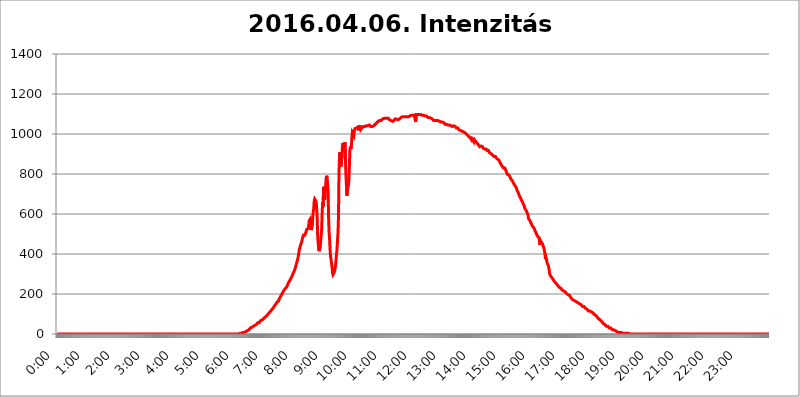
| Category | 2016.04.06. Intenzitás [W/m^2] |
|---|---|
| 0.0 | 0 |
| 0.0006944444444444445 | 0 |
| 0.001388888888888889 | 0 |
| 0.0020833333333333333 | 0 |
| 0.002777777777777778 | 0 |
| 0.003472222222222222 | 0 |
| 0.004166666666666667 | 0 |
| 0.004861111111111111 | 0 |
| 0.005555555555555556 | 0 |
| 0.0062499999999999995 | 0 |
| 0.006944444444444444 | 0 |
| 0.007638888888888889 | 0 |
| 0.008333333333333333 | 0 |
| 0.009027777777777779 | 0 |
| 0.009722222222222222 | 0 |
| 0.010416666666666666 | 0 |
| 0.011111111111111112 | 0 |
| 0.011805555555555555 | 0 |
| 0.012499999999999999 | 0 |
| 0.013194444444444444 | 0 |
| 0.013888888888888888 | 0 |
| 0.014583333333333332 | 0 |
| 0.015277777777777777 | 0 |
| 0.015972222222222224 | 0 |
| 0.016666666666666666 | 0 |
| 0.017361111111111112 | 0 |
| 0.018055555555555557 | 0 |
| 0.01875 | 0 |
| 0.019444444444444445 | 0 |
| 0.02013888888888889 | 0 |
| 0.020833333333333332 | 0 |
| 0.02152777777777778 | 0 |
| 0.022222222222222223 | 0 |
| 0.02291666666666667 | 0 |
| 0.02361111111111111 | 0 |
| 0.024305555555555556 | 0 |
| 0.024999999999999998 | 0 |
| 0.025694444444444447 | 0 |
| 0.02638888888888889 | 0 |
| 0.027083333333333334 | 0 |
| 0.027777777777777776 | 0 |
| 0.02847222222222222 | 0 |
| 0.029166666666666664 | 0 |
| 0.029861111111111113 | 0 |
| 0.030555555555555555 | 0 |
| 0.03125 | 0 |
| 0.03194444444444445 | 0 |
| 0.03263888888888889 | 0 |
| 0.03333333333333333 | 0 |
| 0.034027777777777775 | 0 |
| 0.034722222222222224 | 0 |
| 0.035416666666666666 | 0 |
| 0.036111111111111115 | 0 |
| 0.03680555555555556 | 0 |
| 0.0375 | 0 |
| 0.03819444444444444 | 0 |
| 0.03888888888888889 | 0 |
| 0.03958333333333333 | 0 |
| 0.04027777777777778 | 0 |
| 0.04097222222222222 | 0 |
| 0.041666666666666664 | 0 |
| 0.042361111111111106 | 0 |
| 0.04305555555555556 | 0 |
| 0.043750000000000004 | 0 |
| 0.044444444444444446 | 0 |
| 0.04513888888888889 | 0 |
| 0.04583333333333334 | 0 |
| 0.04652777777777778 | 0 |
| 0.04722222222222222 | 0 |
| 0.04791666666666666 | 0 |
| 0.04861111111111111 | 0 |
| 0.049305555555555554 | 0 |
| 0.049999999999999996 | 0 |
| 0.05069444444444445 | 0 |
| 0.051388888888888894 | 0 |
| 0.052083333333333336 | 0 |
| 0.05277777777777778 | 0 |
| 0.05347222222222222 | 0 |
| 0.05416666666666667 | 0 |
| 0.05486111111111111 | 0 |
| 0.05555555555555555 | 0 |
| 0.05625 | 0 |
| 0.05694444444444444 | 0 |
| 0.057638888888888885 | 0 |
| 0.05833333333333333 | 0 |
| 0.05902777777777778 | 0 |
| 0.059722222222222225 | 0 |
| 0.06041666666666667 | 0 |
| 0.061111111111111116 | 0 |
| 0.06180555555555556 | 0 |
| 0.0625 | 0 |
| 0.06319444444444444 | 0 |
| 0.06388888888888888 | 0 |
| 0.06458333333333334 | 0 |
| 0.06527777777777778 | 0 |
| 0.06597222222222222 | 0 |
| 0.06666666666666667 | 0 |
| 0.06736111111111111 | 0 |
| 0.06805555555555555 | 0 |
| 0.06874999999999999 | 0 |
| 0.06944444444444443 | 0 |
| 0.07013888888888889 | 0 |
| 0.07083333333333333 | 0 |
| 0.07152777777777779 | 0 |
| 0.07222222222222223 | 0 |
| 0.07291666666666667 | 0 |
| 0.07361111111111111 | 0 |
| 0.07430555555555556 | 0 |
| 0.075 | 0 |
| 0.07569444444444444 | 0 |
| 0.0763888888888889 | 0 |
| 0.07708333333333334 | 0 |
| 0.07777777777777778 | 0 |
| 0.07847222222222222 | 0 |
| 0.07916666666666666 | 0 |
| 0.0798611111111111 | 0 |
| 0.08055555555555556 | 0 |
| 0.08125 | 0 |
| 0.08194444444444444 | 0 |
| 0.08263888888888889 | 0 |
| 0.08333333333333333 | 0 |
| 0.08402777777777777 | 0 |
| 0.08472222222222221 | 0 |
| 0.08541666666666665 | 0 |
| 0.08611111111111112 | 0 |
| 0.08680555555555557 | 0 |
| 0.08750000000000001 | 0 |
| 0.08819444444444445 | 0 |
| 0.08888888888888889 | 0 |
| 0.08958333333333333 | 0 |
| 0.09027777777777778 | 0 |
| 0.09097222222222222 | 0 |
| 0.09166666666666667 | 0 |
| 0.09236111111111112 | 0 |
| 0.09305555555555556 | 0 |
| 0.09375 | 0 |
| 0.09444444444444444 | 0 |
| 0.09513888888888888 | 0 |
| 0.09583333333333333 | 0 |
| 0.09652777777777777 | 0 |
| 0.09722222222222222 | 0 |
| 0.09791666666666667 | 0 |
| 0.09861111111111111 | 0 |
| 0.09930555555555555 | 0 |
| 0.09999999999999999 | 0 |
| 0.10069444444444443 | 0 |
| 0.1013888888888889 | 0 |
| 0.10208333333333335 | 0 |
| 0.10277777777777779 | 0 |
| 0.10347222222222223 | 0 |
| 0.10416666666666667 | 0 |
| 0.10486111111111111 | 0 |
| 0.10555555555555556 | 0 |
| 0.10625 | 0 |
| 0.10694444444444444 | 0 |
| 0.1076388888888889 | 0 |
| 0.10833333333333334 | 0 |
| 0.10902777777777778 | 0 |
| 0.10972222222222222 | 0 |
| 0.1111111111111111 | 0 |
| 0.11180555555555556 | 0 |
| 0.11180555555555556 | 0 |
| 0.1125 | 0 |
| 0.11319444444444444 | 0 |
| 0.11388888888888889 | 0 |
| 0.11458333333333333 | 0 |
| 0.11527777777777777 | 0 |
| 0.11597222222222221 | 0 |
| 0.11666666666666665 | 0 |
| 0.1173611111111111 | 0 |
| 0.11805555555555557 | 0 |
| 0.11944444444444445 | 0 |
| 0.12013888888888889 | 0 |
| 0.12083333333333333 | 0 |
| 0.12152777777777778 | 0 |
| 0.12222222222222223 | 0 |
| 0.12291666666666667 | 0 |
| 0.12291666666666667 | 0 |
| 0.12361111111111112 | 0 |
| 0.12430555555555556 | 0 |
| 0.125 | 0 |
| 0.12569444444444444 | 0 |
| 0.12638888888888888 | 0 |
| 0.12708333333333333 | 0 |
| 0.16875 | 0 |
| 0.12847222222222224 | 0 |
| 0.12916666666666668 | 0 |
| 0.12986111111111112 | 0 |
| 0.13055555555555556 | 0 |
| 0.13125 | 0 |
| 0.13194444444444445 | 0 |
| 0.1326388888888889 | 0 |
| 0.13333333333333333 | 0 |
| 0.13402777777777777 | 0 |
| 0.13402777777777777 | 0 |
| 0.13472222222222222 | 0 |
| 0.13541666666666666 | 0 |
| 0.1361111111111111 | 0 |
| 0.13749999999999998 | 0 |
| 0.13819444444444443 | 0 |
| 0.1388888888888889 | 0 |
| 0.13958333333333334 | 0 |
| 0.14027777777777778 | 0 |
| 0.14097222222222222 | 0 |
| 0.14166666666666666 | 0 |
| 0.1423611111111111 | 0 |
| 0.14305555555555557 | 0 |
| 0.14375000000000002 | 0 |
| 0.14444444444444446 | 0 |
| 0.1451388888888889 | 0 |
| 0.1451388888888889 | 0 |
| 0.14652777777777778 | 0 |
| 0.14722222222222223 | 0 |
| 0.14791666666666667 | 0 |
| 0.1486111111111111 | 0 |
| 0.14930555555555555 | 0 |
| 0.15 | 0 |
| 0.15069444444444444 | 0 |
| 0.15138888888888888 | 0 |
| 0.15208333333333332 | 0 |
| 0.15277777777777776 | 0 |
| 0.15347222222222223 | 0 |
| 0.15416666666666667 | 0 |
| 0.15486111111111112 | 0 |
| 0.15555555555555556 | 0 |
| 0.15625 | 0 |
| 0.15694444444444444 | 0 |
| 0.15763888888888888 | 0 |
| 0.15833333333333333 | 0 |
| 0.15902777777777777 | 0 |
| 0.15972222222222224 | 0 |
| 0.16041666666666668 | 0 |
| 0.16111111111111112 | 0 |
| 0.16180555555555556 | 0 |
| 0.1625 | 0 |
| 0.16319444444444445 | 0 |
| 0.1638888888888889 | 0 |
| 0.16458333333333333 | 0 |
| 0.16527777777777777 | 0 |
| 0.16597222222222222 | 0 |
| 0.16666666666666666 | 0 |
| 0.1673611111111111 | 0 |
| 0.16805555555555554 | 0 |
| 0.16874999999999998 | 0 |
| 0.16944444444444443 | 0 |
| 0.17013888888888887 | 0 |
| 0.1708333333333333 | 0 |
| 0.17152777777777775 | 0 |
| 0.17222222222222225 | 0 |
| 0.1729166666666667 | 0 |
| 0.17361111111111113 | 0 |
| 0.17430555555555557 | 0 |
| 0.17500000000000002 | 0 |
| 0.17569444444444446 | 0 |
| 0.1763888888888889 | 0 |
| 0.17708333333333334 | 0 |
| 0.17777777777777778 | 0 |
| 0.17847222222222223 | 0 |
| 0.17916666666666667 | 0 |
| 0.1798611111111111 | 0 |
| 0.18055555555555555 | 0 |
| 0.18125 | 0 |
| 0.18194444444444444 | 0 |
| 0.1826388888888889 | 0 |
| 0.18333333333333335 | 0 |
| 0.1840277777777778 | 0 |
| 0.18472222222222223 | 0 |
| 0.18541666666666667 | 0 |
| 0.18611111111111112 | 0 |
| 0.18680555555555556 | 0 |
| 0.1875 | 0 |
| 0.18819444444444444 | 0 |
| 0.18888888888888888 | 0 |
| 0.18958333333333333 | 0 |
| 0.19027777777777777 | 0 |
| 0.1909722222222222 | 0 |
| 0.19166666666666665 | 0 |
| 0.19236111111111112 | 0 |
| 0.19305555555555554 | 0 |
| 0.19375 | 0 |
| 0.19444444444444445 | 0 |
| 0.1951388888888889 | 0 |
| 0.19583333333333333 | 0 |
| 0.19652777777777777 | 0 |
| 0.19722222222222222 | 0 |
| 0.19791666666666666 | 0 |
| 0.1986111111111111 | 0 |
| 0.19930555555555554 | 0 |
| 0.19999999999999998 | 0 |
| 0.20069444444444443 | 0 |
| 0.20138888888888887 | 0 |
| 0.2020833333333333 | 0 |
| 0.2027777777777778 | 0 |
| 0.2034722222222222 | 0 |
| 0.2041666666666667 | 0 |
| 0.20486111111111113 | 0 |
| 0.20555555555555557 | 0 |
| 0.20625000000000002 | 0 |
| 0.20694444444444446 | 0 |
| 0.2076388888888889 | 0 |
| 0.20833333333333334 | 0 |
| 0.20902777777777778 | 0 |
| 0.20972222222222223 | 0 |
| 0.21041666666666667 | 0 |
| 0.2111111111111111 | 0 |
| 0.21180555555555555 | 0 |
| 0.2125 | 0 |
| 0.21319444444444444 | 0 |
| 0.2138888888888889 | 0 |
| 0.21458333333333335 | 0 |
| 0.2152777777777778 | 0 |
| 0.21597222222222223 | 0 |
| 0.21666666666666667 | 0 |
| 0.21736111111111112 | 0 |
| 0.21805555555555556 | 0 |
| 0.21875 | 0 |
| 0.21944444444444444 | 0 |
| 0.22013888888888888 | 0 |
| 0.22083333333333333 | 0 |
| 0.22152777777777777 | 0 |
| 0.2222222222222222 | 0 |
| 0.22291666666666665 | 0 |
| 0.2236111111111111 | 0 |
| 0.22430555555555556 | 0 |
| 0.225 | 0 |
| 0.22569444444444445 | 0 |
| 0.2263888888888889 | 0 |
| 0.22708333333333333 | 0 |
| 0.22777777777777777 | 0 |
| 0.22847222222222222 | 0 |
| 0.22916666666666666 | 0 |
| 0.2298611111111111 | 0 |
| 0.23055555555555554 | 0 |
| 0.23124999999999998 | 0 |
| 0.23194444444444443 | 0 |
| 0.23263888888888887 | 0 |
| 0.2333333333333333 | 0 |
| 0.2340277777777778 | 0 |
| 0.2347222222222222 | 0 |
| 0.2354166666666667 | 0 |
| 0.23611111111111113 | 0 |
| 0.23680555555555557 | 0 |
| 0.23750000000000002 | 0 |
| 0.23819444444444446 | 0 |
| 0.2388888888888889 | 0 |
| 0.23958333333333334 | 0 |
| 0.24027777777777778 | 0 |
| 0.24097222222222223 | 0 |
| 0.24166666666666667 | 0 |
| 0.2423611111111111 | 0 |
| 0.24305555555555555 | 0 |
| 0.24375 | 0 |
| 0.24444444444444446 | 0 |
| 0.24513888888888888 | 0 |
| 0.24583333333333335 | 0 |
| 0.2465277777777778 | 0 |
| 0.24722222222222223 | 0 |
| 0.24791666666666667 | 0 |
| 0.24861111111111112 | 0 |
| 0.24930555555555556 | 0 |
| 0.25 | 0 |
| 0.25069444444444444 | 0 |
| 0.2513888888888889 | 0 |
| 0.2520833333333333 | 0 |
| 0.25277777777777777 | 0 |
| 0.2534722222222222 | 0 |
| 0.25416666666666665 | 0 |
| 0.2548611111111111 | 0 |
| 0.2555555555555556 | 3.525 |
| 0.25625000000000003 | 3.525 |
| 0.2569444444444445 | 3.525 |
| 0.2576388888888889 | 3.525 |
| 0.25833333333333336 | 3.525 |
| 0.2590277777777778 | 3.525 |
| 0.25972222222222224 | 3.525 |
| 0.2604166666666667 | 7.887 |
| 0.2611111111111111 | 7.887 |
| 0.26180555555555557 | 7.887 |
| 0.2625 | 7.887 |
| 0.26319444444444445 | 12.257 |
| 0.2638888888888889 | 12.257 |
| 0.26458333333333334 | 12.257 |
| 0.2652777777777778 | 16.636 |
| 0.2659722222222222 | 16.636 |
| 0.26666666666666666 | 16.636 |
| 0.2673611111111111 | 21.024 |
| 0.26805555555555555 | 21.024 |
| 0.26875 | 21.024 |
| 0.26944444444444443 | 25.419 |
| 0.2701388888888889 | 25.419 |
| 0.2708333333333333 | 29.823 |
| 0.27152777777777776 | 29.823 |
| 0.2722222222222222 | 29.823 |
| 0.27291666666666664 | 34.234 |
| 0.2736111111111111 | 34.234 |
| 0.2743055555555555 | 34.234 |
| 0.27499999999999997 | 38.653 |
| 0.27569444444444446 | 38.653 |
| 0.27638888888888885 | 38.653 |
| 0.27708333333333335 | 43.079 |
| 0.2777777777777778 | 43.079 |
| 0.27847222222222223 | 47.511 |
| 0.2791666666666667 | 47.511 |
| 0.2798611111111111 | 47.511 |
| 0.28055555555555556 | 51.951 |
| 0.28125 | 56.398 |
| 0.28194444444444444 | 56.398 |
| 0.2826388888888889 | 56.398 |
| 0.2833333333333333 | 56.398 |
| 0.28402777777777777 | 60.85 |
| 0.2847222222222222 | 65.31 |
| 0.28541666666666665 | 65.31 |
| 0.28611111111111115 | 65.31 |
| 0.28680555555555554 | 69.775 |
| 0.28750000000000003 | 69.775 |
| 0.2881944444444445 | 74.246 |
| 0.2888888888888889 | 74.246 |
| 0.28958333333333336 | 74.246 |
| 0.2902777777777778 | 78.722 |
| 0.29097222222222224 | 83.205 |
| 0.2916666666666667 | 83.205 |
| 0.2923611111111111 | 83.205 |
| 0.29305555555555557 | 87.692 |
| 0.29375 | 92.184 |
| 0.29444444444444445 | 92.184 |
| 0.2951388888888889 | 96.682 |
| 0.29583333333333334 | 101.184 |
| 0.2965277777777778 | 101.184 |
| 0.2972222222222222 | 105.69 |
| 0.29791666666666666 | 110.201 |
| 0.2986111111111111 | 110.201 |
| 0.29930555555555555 | 114.716 |
| 0.3 | 114.716 |
| 0.30069444444444443 | 119.235 |
| 0.3013888888888889 | 123.758 |
| 0.3020833333333333 | 128.284 |
| 0.30277777777777776 | 128.284 |
| 0.3034722222222222 | 132.814 |
| 0.30416666666666664 | 137.347 |
| 0.3048611111111111 | 141.884 |
| 0.3055555555555555 | 146.423 |
| 0.30624999999999997 | 146.423 |
| 0.3069444444444444 | 150.964 |
| 0.3076388888888889 | 155.509 |
| 0.30833333333333335 | 160.056 |
| 0.3090277777777778 | 164.605 |
| 0.30972222222222223 | 164.605 |
| 0.3104166666666667 | 164.605 |
| 0.3111111111111111 | 173.709 |
| 0.31180555555555556 | 178.264 |
| 0.3125 | 182.82 |
| 0.31319444444444444 | 187.378 |
| 0.3138888888888889 | 191.937 |
| 0.3145833333333333 | 196.497 |
| 0.31527777777777777 | 201.058 |
| 0.3159722222222222 | 205.62 |
| 0.31666666666666665 | 210.182 |
| 0.31736111111111115 | 214.746 |
| 0.31805555555555554 | 219.309 |
| 0.31875000000000003 | 219.309 |
| 0.3194444444444445 | 223.873 |
| 0.3201388888888889 | 228.436 |
| 0.32083333333333336 | 228.436 |
| 0.3215277777777778 | 233 |
| 0.32222222222222224 | 237.564 |
| 0.3229166666666667 | 242.127 |
| 0.3236111111111111 | 251.251 |
| 0.32430555555555557 | 255.813 |
| 0.325 | 260.373 |
| 0.32569444444444445 | 260.373 |
| 0.3263888888888889 | 269.49 |
| 0.32708333333333334 | 269.49 |
| 0.3277777777777778 | 278.603 |
| 0.3284722222222222 | 283.156 |
| 0.32916666666666666 | 287.709 |
| 0.3298611111111111 | 292.259 |
| 0.33055555555555555 | 301.354 |
| 0.33125 | 305.898 |
| 0.33194444444444443 | 310.44 |
| 0.3326388888888889 | 314.98 |
| 0.3333333333333333 | 324.052 |
| 0.3340277777777778 | 333.113 |
| 0.3347222222222222 | 342.162 |
| 0.3354166666666667 | 351.198 |
| 0.3361111111111111 | 360.221 |
| 0.3368055555555556 | 369.23 |
| 0.33749999999999997 | 378.224 |
| 0.33819444444444446 | 391.685 |
| 0.33888888888888885 | 405.108 |
| 0.33958333333333335 | 422.943 |
| 0.34027777777777773 | 431.833 |
| 0.34097222222222223 | 440.702 |
| 0.3416666666666666 | 449.551 |
| 0.3423611111111111 | 453.968 |
| 0.3430555555555555 | 462.786 |
| 0.34375 | 475.972 |
| 0.3444444444444445 | 484.735 |
| 0.3451388888888889 | 493.475 |
| 0.3458333333333334 | 493.475 |
| 0.34652777777777777 | 489.108 |
| 0.34722222222222227 | 493.475 |
| 0.34791666666666665 | 489.108 |
| 0.34861111111111115 | 497.836 |
| 0.34930555555555554 | 515.223 |
| 0.35000000000000003 | 523.88 |
| 0.3506944444444444 | 519.555 |
| 0.3513888888888889 | 519.555 |
| 0.3520833333333333 | 528.2 |
| 0.3527777777777778 | 545.416 |
| 0.3534722222222222 | 566.793 |
| 0.3541666666666667 | 562.53 |
| 0.3548611111111111 | 575.299 |
| 0.35555555555555557 | 562.53 |
| 0.35625 | 519.555 |
| 0.35694444444444445 | 532.513 |
| 0.3576388888888889 | 541.121 |
| 0.35833333333333334 | 545.416 |
| 0.3590277777777778 | 613.252 |
| 0.3597222222222222 | 625.784 |
| 0.36041666666666666 | 667.123 |
| 0.3611111111111111 | 675.311 |
| 0.36180555555555555 | 679.395 |
| 0.3625 | 667.123 |
| 0.36319444444444443 | 658.909 |
| 0.3638888888888889 | 625.784 |
| 0.3645833333333333 | 579.542 |
| 0.3652777777777778 | 484.735 |
| 0.3659722222222222 | 480.356 |
| 0.3666666666666667 | 422.943 |
| 0.3673611111111111 | 414.035 |
| 0.3680555555555556 | 414.035 |
| 0.36874999999999997 | 436.27 |
| 0.36944444444444446 | 462.786 |
| 0.37013888888888885 | 493.475 |
| 0.37083333333333335 | 523.88 |
| 0.37152777777777773 | 604.864 |
| 0.37222222222222223 | 658.909 |
| 0.3729166666666666 | 638.256 |
| 0.3736111111111111 | 735.89 |
| 0.3743055555555555 | 711.832 |
| 0.375 | 671.22 |
| 0.3756944444444445 | 691.608 |
| 0.3763888888888889 | 691.608 |
| 0.3770833333333334 | 775.492 |
| 0.37777777777777777 | 791.169 |
| 0.37847222222222227 | 783.342 |
| 0.37916666666666665 | 755.766 |
| 0.37986111111111115 | 715.858 |
| 0.38055555555555554 | 583.779 |
| 0.38125000000000003 | 510.885 |
| 0.3819444444444444 | 475.972 |
| 0.3826388888888889 | 422.943 |
| 0.3833333333333333 | 387.202 |
| 0.3840277777777778 | 373.729 |
| 0.3847222222222222 | 351.198 |
| 0.3854166666666667 | 333.113 |
| 0.3861111111111111 | 305.898 |
| 0.38680555555555557 | 296.808 |
| 0.3875 | 296.808 |
| 0.38819444444444445 | 305.898 |
| 0.3888888888888889 | 305.898 |
| 0.38958333333333334 | 324.052 |
| 0.3902777777777778 | 342.162 |
| 0.3909722222222222 | 369.23 |
| 0.39166666666666666 | 400.638 |
| 0.3923611111111111 | 422.943 |
| 0.39305555555555555 | 467.187 |
| 0.39375 | 506.542 |
| 0.39444444444444443 | 588.009 |
| 0.3951388888888889 | 806.757 |
| 0.3958333333333333 | 887.309 |
| 0.3965277777777778 | 909.996 |
| 0.3972222222222222 | 875.918 |
| 0.3979166666666667 | 837.682 |
| 0.3986111111111111 | 868.305 |
| 0.3993055555555556 | 883.516 |
| 0.39999999999999997 | 940.082 |
| 0.40069444444444446 | 955.071 |
| 0.40138888888888885 | 928.819 |
| 0.40208333333333335 | 917.534 |
| 0.40277777777777773 | 940.082 |
| 0.40347222222222223 | 958.814 |
| 0.4041666666666666 | 875.918 |
| 0.4048611111111111 | 798.974 |
| 0.4055555555555555 | 743.859 |
| 0.40625 | 691.608 |
| 0.4069444444444445 | 687.544 |
| 0.4076388888888889 | 735.89 |
| 0.4083333333333334 | 743.859 |
| 0.40902777777777777 | 767.62 |
| 0.40972222222222227 | 837.682 |
| 0.41041666666666665 | 917.534 |
| 0.41111111111111115 | 936.33 |
| 0.41180555555555554 | 925.06 |
| 0.41250000000000003 | 940.082 |
| 0.4131944444444444 | 981.244 |
| 0.4138888888888889 | 1007.383 |
| 0.4145833333333333 | 1011.118 |
| 0.4152777777777778 | 1007.383 |
| 0.4159722222222222 | 992.448 |
| 0.4166666666666667 | 1018.587 |
| 0.4173611111111111 | 1026.06 |
| 0.41805555555555557 | 1026.06 |
| 0.41875 | 1029.798 |
| 0.41944444444444445 | 1029.798 |
| 0.4201388888888889 | 1033.537 |
| 0.42083333333333334 | 1029.798 |
| 0.4215277777777778 | 1033.537 |
| 0.4222222222222222 | 1018.587 |
| 0.42291666666666666 | 1037.277 |
| 0.4236111111111111 | 1037.277 |
| 0.42430555555555555 | 1037.277 |
| 0.425 | 1037.277 |
| 0.42569444444444443 | 1022.323 |
| 0.4263888888888889 | 1022.323 |
| 0.4270833333333333 | 1029.798 |
| 0.4277777777777778 | 1033.537 |
| 0.4284722222222222 | 1033.537 |
| 0.4291666666666667 | 1037.277 |
| 0.4298611111111111 | 1037.277 |
| 0.4305555555555556 | 1037.277 |
| 0.43124999999999997 | 1037.277 |
| 0.43194444444444446 | 1037.277 |
| 0.43263888888888885 | 1041.019 |
| 0.43333333333333335 | 1041.019 |
| 0.43402777777777773 | 1041.019 |
| 0.43472222222222223 | 1041.019 |
| 0.4354166666666666 | 1041.019 |
| 0.4361111111111111 | 1041.019 |
| 0.4368055555555555 | 1044.762 |
| 0.4375 | 1044.762 |
| 0.4381944444444445 | 1044.762 |
| 0.4388888888888889 | 1041.019 |
| 0.4395833333333334 | 1037.277 |
| 0.44027777777777777 | 1037.277 |
| 0.44097222222222227 | 1037.277 |
| 0.44166666666666665 | 1037.277 |
| 0.44236111111111115 | 1037.277 |
| 0.44305555555555554 | 1041.019 |
| 0.44375000000000003 | 1041.019 |
| 0.4444444444444444 | 1041.019 |
| 0.4451388888888889 | 1041.019 |
| 0.4458333333333333 | 1048.508 |
| 0.4465277777777778 | 1044.762 |
| 0.4472222222222222 | 1048.508 |
| 0.4479166666666667 | 1056.004 |
| 0.4486111111111111 | 1056.004 |
| 0.44930555555555557 | 1056.004 |
| 0.45 | 1063.51 |
| 0.45069444444444445 | 1063.51 |
| 0.4513888888888889 | 1067.267 |
| 0.45208333333333334 | 1067.267 |
| 0.4527777777777778 | 1067.267 |
| 0.4534722222222222 | 1067.267 |
| 0.45416666666666666 | 1067.267 |
| 0.4548611111111111 | 1067.267 |
| 0.45555555555555555 | 1071.027 |
| 0.45625 | 1074.789 |
| 0.45694444444444443 | 1074.789 |
| 0.4576388888888889 | 1078.555 |
| 0.4583333333333333 | 1078.555 |
| 0.4590277777777778 | 1078.555 |
| 0.4597222222222222 | 1078.555 |
| 0.4604166666666667 | 1078.555 |
| 0.4611111111111111 | 1074.789 |
| 0.4618055555555556 | 1078.555 |
| 0.46249999999999997 | 1078.555 |
| 0.46319444444444446 | 1078.555 |
| 0.46388888888888885 | 1078.555 |
| 0.46458333333333335 | 1078.555 |
| 0.46527777777777773 | 1074.789 |
| 0.46597222222222223 | 1071.027 |
| 0.4666666666666666 | 1071.027 |
| 0.4673611111111111 | 1071.027 |
| 0.4680555555555555 | 1067.267 |
| 0.46875 | 1067.267 |
| 0.4694444444444445 | 1067.267 |
| 0.4701388888888889 | 1063.51 |
| 0.4708333333333334 | 1063.51 |
| 0.47152777777777777 | 1063.51 |
| 0.47222222222222227 | 1067.267 |
| 0.47291666666666665 | 1071.027 |
| 0.47361111111111115 | 1074.789 |
| 0.47430555555555554 | 1071.027 |
| 0.47500000000000003 | 1071.027 |
| 0.4756944444444444 | 1074.789 |
| 0.4763888888888889 | 1078.555 |
| 0.4770833333333333 | 1074.789 |
| 0.4777777777777778 | 1071.027 |
| 0.4784722222222222 | 1071.027 |
| 0.4791666666666667 | 1071.027 |
| 0.4798611111111111 | 1074.789 |
| 0.48055555555555557 | 1078.555 |
| 0.48125 | 1078.555 |
| 0.48194444444444445 | 1082.324 |
| 0.4826388888888889 | 1082.324 |
| 0.48333333333333334 | 1086.097 |
| 0.4840277777777778 | 1086.097 |
| 0.4847222222222222 | 1086.097 |
| 0.48541666666666666 | 1086.097 |
| 0.4861111111111111 | 1086.097 |
| 0.48680555555555555 | 1086.097 |
| 0.4875 | 1086.097 |
| 0.48819444444444443 | 1086.097 |
| 0.4888888888888889 | 1082.324 |
| 0.4895833333333333 | 1086.097 |
| 0.4902777777777778 | 1086.097 |
| 0.4909722222222222 | 1082.324 |
| 0.4916666666666667 | 1086.097 |
| 0.4923611111111111 | 1086.097 |
| 0.4930555555555556 | 1086.097 |
| 0.49374999999999997 | 1086.097 |
| 0.49444444444444446 | 1089.873 |
| 0.49513888888888885 | 1089.873 |
| 0.49583333333333335 | 1093.653 |
| 0.49652777777777773 | 1093.653 |
| 0.49722222222222223 | 1093.653 |
| 0.4979166666666666 | 1093.653 |
| 0.4986111111111111 | 1093.653 |
| 0.4993055555555555 | 1093.653 |
| 0.5 | 1093.653 |
| 0.5006944444444444 | 1093.653 |
| 0.5013888888888889 | 1097.437 |
| 0.5020833333333333 | 1097.437 |
| 0.5027777777777778 | 1059.756 |
| 0.5034722222222222 | 1097.437 |
| 0.5041666666666667 | 1097.437 |
| 0.5048611111111111 | 1097.437 |
| 0.5055555555555555 | 1097.437 |
| 0.50625 | 1093.653 |
| 0.5069444444444444 | 1093.653 |
| 0.5076388888888889 | 1097.437 |
| 0.5083333333333333 | 1097.437 |
| 0.5090277777777777 | 1097.437 |
| 0.5097222222222222 | 1097.437 |
| 0.5104166666666666 | 1093.653 |
| 0.5111111111111112 | 1093.653 |
| 0.5118055555555555 | 1093.653 |
| 0.5125000000000001 | 1093.653 |
| 0.5131944444444444 | 1089.873 |
| 0.513888888888889 | 1093.653 |
| 0.5145833333333333 | 1093.653 |
| 0.5152777777777778 | 1089.873 |
| 0.5159722222222222 | 1089.873 |
| 0.5166666666666667 | 1089.873 |
| 0.517361111111111 | 1089.873 |
| 0.5180555555555556 | 1089.873 |
| 0.5187499999999999 | 1086.097 |
| 0.5194444444444445 | 1086.097 |
| 0.5201388888888888 | 1082.324 |
| 0.5208333333333334 | 1082.324 |
| 0.5215277777777778 | 1082.324 |
| 0.5222222222222223 | 1082.324 |
| 0.5229166666666667 | 1082.324 |
| 0.5236111111111111 | 1082.324 |
| 0.5243055555555556 | 1078.555 |
| 0.525 | 1078.555 |
| 0.5256944444444445 | 1078.555 |
| 0.5263888888888889 | 1074.789 |
| 0.5270833333333333 | 1074.789 |
| 0.5277777777777778 | 1067.267 |
| 0.5284722222222222 | 1067.267 |
| 0.5291666666666667 | 1067.267 |
| 0.5298611111111111 | 1067.267 |
| 0.5305555555555556 | 1067.267 |
| 0.53125 | 1063.51 |
| 0.5319444444444444 | 1067.267 |
| 0.5326388888888889 | 1063.51 |
| 0.5333333333333333 | 1067.267 |
| 0.5340277777777778 | 1067.267 |
| 0.5347222222222222 | 1063.51 |
| 0.5354166666666667 | 1063.51 |
| 0.5361111111111111 | 1063.51 |
| 0.5368055555555555 | 1063.51 |
| 0.5375 | 1063.51 |
| 0.5381944444444444 | 1059.756 |
| 0.5388888888888889 | 1059.756 |
| 0.5395833333333333 | 1059.756 |
| 0.5402777777777777 | 1059.756 |
| 0.5409722222222222 | 1056.004 |
| 0.5416666666666666 | 1056.004 |
| 0.5423611111111112 | 1056.004 |
| 0.5430555555555555 | 1052.255 |
| 0.5437500000000001 | 1048.508 |
| 0.5444444444444444 | 1048.508 |
| 0.545138888888889 | 1048.508 |
| 0.5458333333333333 | 1048.508 |
| 0.5465277777777778 | 1044.762 |
| 0.5472222222222222 | 1044.762 |
| 0.5479166666666667 | 1044.762 |
| 0.548611111111111 | 1044.762 |
| 0.5493055555555556 | 1044.762 |
| 0.5499999999999999 | 1044.762 |
| 0.5506944444444445 | 1044.762 |
| 0.5513888888888888 | 1044.762 |
| 0.5520833333333334 | 1041.019 |
| 0.5527777777777778 | 1041.019 |
| 0.5534722222222223 | 1041.019 |
| 0.5541666666666667 | 1037.277 |
| 0.5548611111111111 | 1037.277 |
| 0.5555555555555556 | 1037.277 |
| 0.55625 | 1041.019 |
| 0.5569444444444445 | 1037.277 |
| 0.5576388888888889 | 1037.277 |
| 0.5583333333333333 | 1037.277 |
| 0.5590277777777778 | 1033.537 |
| 0.5597222222222222 | 1029.798 |
| 0.5604166666666667 | 1033.537 |
| 0.5611111111111111 | 1029.798 |
| 0.5618055555555556 | 1029.798 |
| 0.5625 | 1026.06 |
| 0.5631944444444444 | 1022.323 |
| 0.5638888888888889 | 1022.323 |
| 0.5645833333333333 | 1018.587 |
| 0.5652777777777778 | 1018.587 |
| 0.5659722222222222 | 1018.587 |
| 0.5666666666666667 | 1018.587 |
| 0.5673611111111111 | 1014.852 |
| 0.5680555555555555 | 1014.852 |
| 0.56875 | 1014.852 |
| 0.5694444444444444 | 1011.118 |
| 0.5701388888888889 | 1011.118 |
| 0.5708333333333333 | 1007.383 |
| 0.5715277777777777 | 1007.383 |
| 0.5722222222222222 | 1003.65 |
| 0.5729166666666666 | 1003.65 |
| 0.5736111111111112 | 999.916 |
| 0.5743055555555555 | 996.182 |
| 0.5750000000000001 | 996.182 |
| 0.5756944444444444 | 992.448 |
| 0.576388888888889 | 992.448 |
| 0.5770833333333333 | 988.714 |
| 0.5777777777777778 | 984.98 |
| 0.5784722222222222 | 981.244 |
| 0.5791666666666667 | 981.244 |
| 0.579861111111111 | 977.508 |
| 0.5805555555555556 | 977.508 |
| 0.5812499999999999 | 970.034 |
| 0.5819444444444445 | 977.508 |
| 0.5826388888888888 | 977.508 |
| 0.5833333333333334 | 973.772 |
| 0.5840277777777778 | 970.034 |
| 0.5847222222222223 | 962.555 |
| 0.5854166666666667 | 970.034 |
| 0.5861111111111111 | 966.295 |
| 0.5868055555555556 | 962.555 |
| 0.5875 | 962.555 |
| 0.5881944444444445 | 958.814 |
| 0.5888888888888889 | 955.071 |
| 0.5895833333333333 | 951.327 |
| 0.5902777777777778 | 947.58 |
| 0.5909722222222222 | 947.58 |
| 0.5916666666666667 | 943.832 |
| 0.5923611111111111 | 936.33 |
| 0.5930555555555556 | 936.33 |
| 0.59375 | 940.082 |
| 0.5944444444444444 | 940.082 |
| 0.5951388888888889 | 936.33 |
| 0.5958333333333333 | 936.33 |
| 0.5965277777777778 | 936.33 |
| 0.5972222222222222 | 928.819 |
| 0.5979166666666667 | 925.06 |
| 0.5986111111111111 | 928.819 |
| 0.5993055555555555 | 925.06 |
| 0.6 | 921.298 |
| 0.6006944444444444 | 921.298 |
| 0.6013888888888889 | 925.06 |
| 0.6020833333333333 | 925.06 |
| 0.6027777777777777 | 917.534 |
| 0.6034722222222222 | 917.534 |
| 0.6041666666666666 | 917.534 |
| 0.6048611111111112 | 917.534 |
| 0.6055555555555555 | 913.766 |
| 0.6062500000000001 | 906.223 |
| 0.6069444444444444 | 902.447 |
| 0.607638888888889 | 909.996 |
| 0.6083333333333333 | 902.447 |
| 0.6090277777777778 | 902.447 |
| 0.6097222222222222 | 898.668 |
| 0.6104166666666667 | 894.885 |
| 0.611111111111111 | 891.099 |
| 0.6118055555555556 | 891.099 |
| 0.6124999999999999 | 887.309 |
| 0.6131944444444445 | 891.099 |
| 0.6138888888888888 | 891.099 |
| 0.6145833333333334 | 887.309 |
| 0.6152777777777778 | 887.309 |
| 0.6159722222222223 | 883.516 |
| 0.6166666666666667 | 875.918 |
| 0.6173611111111111 | 872.114 |
| 0.6180555555555556 | 872.114 |
| 0.61875 | 872.114 |
| 0.6194444444444445 | 868.305 |
| 0.6201388888888889 | 864.493 |
| 0.6208333333333333 | 860.676 |
| 0.6215277777777778 | 853.029 |
| 0.6222222222222222 | 849.199 |
| 0.6229166666666667 | 845.365 |
| 0.6236111111111111 | 845.365 |
| 0.6243055555555556 | 837.682 |
| 0.625 | 837.682 |
| 0.6256944444444444 | 829.981 |
| 0.6263888888888889 | 829.981 |
| 0.6270833333333333 | 829.981 |
| 0.6277777777777778 | 829.981 |
| 0.6284722222222222 | 826.123 |
| 0.6291666666666667 | 818.392 |
| 0.6298611111111111 | 810.641 |
| 0.6305555555555555 | 806.757 |
| 0.63125 | 798.974 |
| 0.6319444444444444 | 795.074 |
| 0.6326388888888889 | 798.974 |
| 0.6333333333333333 | 795.074 |
| 0.6340277777777777 | 791.169 |
| 0.6347222222222222 | 787.258 |
| 0.6354166666666666 | 783.342 |
| 0.6361111111111112 | 775.492 |
| 0.6368055555555555 | 771.559 |
| 0.6375000000000001 | 771.559 |
| 0.6381944444444444 | 767.62 |
| 0.638888888888889 | 763.674 |
| 0.6395833333333333 | 755.766 |
| 0.6402777777777778 | 751.803 |
| 0.6409722222222222 | 747.834 |
| 0.6416666666666667 | 743.859 |
| 0.642361111111111 | 739.877 |
| 0.6430555555555556 | 735.89 |
| 0.6437499999999999 | 731.896 |
| 0.6444444444444445 | 723.889 |
| 0.6451388888888888 | 715.858 |
| 0.6458333333333334 | 711.832 |
| 0.6465277777777778 | 707.8 |
| 0.6472222222222223 | 699.717 |
| 0.6479166666666667 | 695.666 |
| 0.6486111111111111 | 687.544 |
| 0.6493055555555556 | 683.473 |
| 0.65 | 679.395 |
| 0.6506944444444445 | 671.22 |
| 0.6513888888888889 | 667.123 |
| 0.6520833333333333 | 663.019 |
| 0.6527777777777778 | 658.909 |
| 0.6534722222222222 | 650.667 |
| 0.6541666666666667 | 646.537 |
| 0.6548611111111111 | 642.4 |
| 0.6555555555555556 | 629.948 |
| 0.65625 | 625.784 |
| 0.6569444444444444 | 621.613 |
| 0.6576388888888889 | 617.436 |
| 0.6583333333333333 | 613.252 |
| 0.6590277777777778 | 609.062 |
| 0.6597222222222222 | 600.661 |
| 0.6604166666666667 | 592.233 |
| 0.6611111111111111 | 575.299 |
| 0.6618055555555555 | 571.049 |
| 0.6625 | 571.049 |
| 0.6631944444444444 | 566.793 |
| 0.6638888888888889 | 558.261 |
| 0.6645833333333333 | 553.986 |
| 0.6652777777777777 | 549.704 |
| 0.6659722222222222 | 541.121 |
| 0.6666666666666666 | 541.121 |
| 0.6673611111111111 | 536.82 |
| 0.6680555555555556 | 532.513 |
| 0.6687500000000001 | 528.2 |
| 0.6694444444444444 | 523.88 |
| 0.6701388888888888 | 515.223 |
| 0.6708333333333334 | 515.223 |
| 0.6715277777777778 | 506.542 |
| 0.6722222222222222 | 497.836 |
| 0.6729166666666666 | 493.475 |
| 0.6736111111111112 | 489.108 |
| 0.6743055555555556 | 489.108 |
| 0.6749999999999999 | 484.735 |
| 0.6756944444444444 | 480.356 |
| 0.6763888888888889 | 475.972 |
| 0.6770833333333334 | 445.129 |
| 0.6777777777777777 | 467.187 |
| 0.6784722222222223 | 467.187 |
| 0.6791666666666667 | 458.38 |
| 0.6798611111111111 | 458.38 |
| 0.6805555555555555 | 449.551 |
| 0.68125 | 445.129 |
| 0.6819444444444445 | 436.27 |
| 0.6826388888888889 | 427.39 |
| 0.6833333333333332 | 414.035 |
| 0.6840277777777778 | 400.638 |
| 0.6847222222222222 | 373.729 |
| 0.6854166666666667 | 382.715 |
| 0.686111111111111 | 373.729 |
| 0.6868055555555556 | 360.221 |
| 0.6875 | 351.198 |
| 0.6881944444444444 | 346.682 |
| 0.688888888888889 | 342.162 |
| 0.6895833333333333 | 328.584 |
| 0.6902777777777778 | 310.44 |
| 0.6909722222222222 | 296.808 |
| 0.6916666666666668 | 292.259 |
| 0.6923611111111111 | 287.709 |
| 0.6930555555555555 | 283.156 |
| 0.69375 | 283.156 |
| 0.6944444444444445 | 278.603 |
| 0.6951388888888889 | 274.047 |
| 0.6958333333333333 | 269.49 |
| 0.6965277777777777 | 269.49 |
| 0.6972222222222223 | 264.932 |
| 0.6979166666666666 | 260.373 |
| 0.6986111111111111 | 260.373 |
| 0.6993055555555556 | 255.813 |
| 0.7000000000000001 | 251.251 |
| 0.7006944444444444 | 246.689 |
| 0.7013888888888888 | 246.689 |
| 0.7020833333333334 | 242.127 |
| 0.7027777777777778 | 242.127 |
| 0.7034722222222222 | 237.564 |
| 0.7041666666666666 | 233 |
| 0.7048611111111112 | 233 |
| 0.7055555555555556 | 228.436 |
| 0.7062499999999999 | 228.436 |
| 0.7069444444444444 | 223.873 |
| 0.7076388888888889 | 223.873 |
| 0.7083333333333334 | 219.309 |
| 0.7090277777777777 | 219.309 |
| 0.7097222222222223 | 214.746 |
| 0.7104166666666667 | 214.746 |
| 0.7111111111111111 | 214.746 |
| 0.7118055555555555 | 210.182 |
| 0.7125 | 210.182 |
| 0.7131944444444445 | 205.62 |
| 0.7138888888888889 | 205.62 |
| 0.7145833333333332 | 201.058 |
| 0.7152777777777778 | 201.058 |
| 0.7159722222222222 | 201.058 |
| 0.7166666666666667 | 196.497 |
| 0.717361111111111 | 196.497 |
| 0.7180555555555556 | 191.937 |
| 0.71875 | 191.937 |
| 0.7194444444444444 | 187.378 |
| 0.720138888888889 | 182.82 |
| 0.7208333333333333 | 182.82 |
| 0.7215277777777778 | 178.264 |
| 0.7222222222222222 | 173.709 |
| 0.7229166666666668 | 173.709 |
| 0.7236111111111111 | 173.709 |
| 0.7243055555555555 | 169.156 |
| 0.725 | 169.156 |
| 0.7256944444444445 | 169.156 |
| 0.7263888888888889 | 164.605 |
| 0.7270833333333333 | 164.605 |
| 0.7277777777777777 | 160.056 |
| 0.7284722222222223 | 160.056 |
| 0.7291666666666666 | 155.509 |
| 0.7298611111111111 | 155.509 |
| 0.7305555555555556 | 155.509 |
| 0.7312500000000001 | 150.964 |
| 0.7319444444444444 | 150.964 |
| 0.7326388888888888 | 150.964 |
| 0.7333333333333334 | 146.423 |
| 0.7340277777777778 | 146.423 |
| 0.7347222222222222 | 146.423 |
| 0.7354166666666666 | 141.884 |
| 0.7361111111111112 | 141.884 |
| 0.7368055555555556 | 137.347 |
| 0.7374999999999999 | 137.347 |
| 0.7381944444444444 | 137.347 |
| 0.7388888888888889 | 137.347 |
| 0.7395833333333334 | 132.814 |
| 0.7402777777777777 | 132.814 |
| 0.7409722222222223 | 128.284 |
| 0.7416666666666667 | 128.284 |
| 0.7423611111111111 | 128.284 |
| 0.7430555555555555 | 123.758 |
| 0.74375 | 119.235 |
| 0.7444444444444445 | 119.235 |
| 0.7451388888888889 | 114.716 |
| 0.7458333333333332 | 114.716 |
| 0.7465277777777778 | 114.716 |
| 0.7472222222222222 | 114.716 |
| 0.7479166666666667 | 110.201 |
| 0.748611111111111 | 110.201 |
| 0.7493055555555556 | 110.201 |
| 0.75 | 105.69 |
| 0.7506944444444444 | 105.69 |
| 0.751388888888889 | 105.69 |
| 0.7520833333333333 | 101.184 |
| 0.7527777777777778 | 101.184 |
| 0.7534722222222222 | 96.682 |
| 0.7541666666666668 | 96.682 |
| 0.7548611111111111 | 92.184 |
| 0.7555555555555555 | 92.184 |
| 0.75625 | 87.692 |
| 0.7569444444444445 | 87.692 |
| 0.7576388888888889 | 83.205 |
| 0.7583333333333333 | 78.722 |
| 0.7590277777777777 | 78.722 |
| 0.7597222222222223 | 74.246 |
| 0.7604166666666666 | 74.246 |
| 0.7611111111111111 | 74.246 |
| 0.7618055555555556 | 69.775 |
| 0.7625000000000001 | 65.31 |
| 0.7631944444444444 | 65.31 |
| 0.7638888888888888 | 60.85 |
| 0.7645833333333334 | 56.398 |
| 0.7652777777777778 | 56.398 |
| 0.7659722222222222 | 51.951 |
| 0.7666666666666666 | 51.951 |
| 0.7673611111111112 | 47.511 |
| 0.7680555555555556 | 47.511 |
| 0.7687499999999999 | 43.079 |
| 0.7694444444444444 | 43.079 |
| 0.7701388888888889 | 38.653 |
| 0.7708333333333334 | 38.653 |
| 0.7715277777777777 | 38.653 |
| 0.7722222222222223 | 38.653 |
| 0.7729166666666667 | 34.234 |
| 0.7736111111111111 | 34.234 |
| 0.7743055555555555 | 29.823 |
| 0.775 | 29.823 |
| 0.7756944444444445 | 29.823 |
| 0.7763888888888889 | 29.823 |
| 0.7770833333333332 | 25.419 |
| 0.7777777777777778 | 25.419 |
| 0.7784722222222222 | 21.024 |
| 0.7791666666666667 | 21.024 |
| 0.779861111111111 | 21.024 |
| 0.7805555555555556 | 21.024 |
| 0.78125 | 16.636 |
| 0.7819444444444444 | 16.636 |
| 0.782638888888889 | 16.636 |
| 0.7833333333333333 | 12.257 |
| 0.7840277777777778 | 12.257 |
| 0.7847222222222222 | 12.257 |
| 0.7854166666666668 | 12.257 |
| 0.7861111111111111 | 12.257 |
| 0.7868055555555555 | 7.887 |
| 0.7875 | 7.887 |
| 0.7881944444444445 | 7.887 |
| 0.7888888888888889 | 7.887 |
| 0.7895833333333333 | 7.887 |
| 0.7902777777777777 | 7.887 |
| 0.7909722222222223 | 7.887 |
| 0.7916666666666666 | 7.887 |
| 0.7923611111111111 | 3.525 |
| 0.7930555555555556 | 3.525 |
| 0.7937500000000001 | 3.525 |
| 0.7944444444444444 | 3.525 |
| 0.7951388888888888 | 3.525 |
| 0.7958333333333334 | 3.525 |
| 0.7965277777777778 | 3.525 |
| 0.7972222222222222 | 3.525 |
| 0.7979166666666666 | 3.525 |
| 0.7986111111111112 | 3.525 |
| 0.7993055555555556 | 3.525 |
| 0.7999999999999999 | 3.525 |
| 0.8006944444444444 | 3.525 |
| 0.8013888888888889 | 3.525 |
| 0.8020833333333334 | 3.525 |
| 0.8027777777777777 | 3.525 |
| 0.8034722222222223 | 0 |
| 0.8041666666666667 | 0 |
| 0.8048611111111111 | 0 |
| 0.8055555555555555 | 0 |
| 0.80625 | 0 |
| 0.8069444444444445 | 0 |
| 0.8076388888888889 | 0 |
| 0.8083333333333332 | 0 |
| 0.8090277777777778 | 0 |
| 0.8097222222222222 | 0 |
| 0.8104166666666667 | 0 |
| 0.811111111111111 | 0 |
| 0.8118055555555556 | 0 |
| 0.8125 | 0 |
| 0.8131944444444444 | 0 |
| 0.813888888888889 | 0 |
| 0.8145833333333333 | 0 |
| 0.8152777777777778 | 0 |
| 0.8159722222222222 | 0 |
| 0.8166666666666668 | 0 |
| 0.8173611111111111 | 0 |
| 0.8180555555555555 | 0 |
| 0.81875 | 0 |
| 0.8194444444444445 | 0 |
| 0.8201388888888889 | 0 |
| 0.8208333333333333 | 0 |
| 0.8215277777777777 | 0 |
| 0.8222222222222223 | 0 |
| 0.8229166666666666 | 0 |
| 0.8236111111111111 | 0 |
| 0.8243055555555556 | 0 |
| 0.8250000000000001 | 0 |
| 0.8256944444444444 | 0 |
| 0.8263888888888888 | 0 |
| 0.8270833333333334 | 0 |
| 0.8277777777777778 | 0 |
| 0.8284722222222222 | 0 |
| 0.8291666666666666 | 0 |
| 0.8298611111111112 | 0 |
| 0.8305555555555556 | 0 |
| 0.8312499999999999 | 0 |
| 0.8319444444444444 | 0 |
| 0.8326388888888889 | 0 |
| 0.8333333333333334 | 0 |
| 0.8340277777777777 | 0 |
| 0.8347222222222223 | 0 |
| 0.8354166666666667 | 0 |
| 0.8361111111111111 | 0 |
| 0.8368055555555555 | 0 |
| 0.8375 | 0 |
| 0.8381944444444445 | 0 |
| 0.8388888888888889 | 0 |
| 0.8395833333333332 | 0 |
| 0.8402777777777778 | 0 |
| 0.8409722222222222 | 0 |
| 0.8416666666666667 | 0 |
| 0.842361111111111 | 0 |
| 0.8430555555555556 | 0 |
| 0.84375 | 0 |
| 0.8444444444444444 | 0 |
| 0.845138888888889 | 0 |
| 0.8458333333333333 | 0 |
| 0.8465277777777778 | 0 |
| 0.8472222222222222 | 0 |
| 0.8479166666666668 | 0 |
| 0.8486111111111111 | 0 |
| 0.8493055555555555 | 0 |
| 0.85 | 0 |
| 0.8506944444444445 | 0 |
| 0.8513888888888889 | 0 |
| 0.8520833333333333 | 0 |
| 0.8527777777777777 | 0 |
| 0.8534722222222223 | 0 |
| 0.8541666666666666 | 0 |
| 0.8548611111111111 | 0 |
| 0.8555555555555556 | 0 |
| 0.8562500000000001 | 0 |
| 0.8569444444444444 | 0 |
| 0.8576388888888888 | 0 |
| 0.8583333333333334 | 0 |
| 0.8590277777777778 | 0 |
| 0.8597222222222222 | 0 |
| 0.8604166666666666 | 0 |
| 0.8611111111111112 | 0 |
| 0.8618055555555556 | 0 |
| 0.8624999999999999 | 0 |
| 0.8631944444444444 | 0 |
| 0.8638888888888889 | 0 |
| 0.8645833333333334 | 0 |
| 0.8652777777777777 | 0 |
| 0.8659722222222223 | 0 |
| 0.8666666666666667 | 0 |
| 0.8673611111111111 | 0 |
| 0.8680555555555555 | 0 |
| 0.86875 | 0 |
| 0.8694444444444445 | 0 |
| 0.8701388888888889 | 0 |
| 0.8708333333333332 | 0 |
| 0.8715277777777778 | 0 |
| 0.8722222222222222 | 0 |
| 0.8729166666666667 | 0 |
| 0.873611111111111 | 0 |
| 0.8743055555555556 | 0 |
| 0.875 | 0 |
| 0.8756944444444444 | 0 |
| 0.876388888888889 | 0 |
| 0.8770833333333333 | 0 |
| 0.8777777777777778 | 0 |
| 0.8784722222222222 | 0 |
| 0.8791666666666668 | 0 |
| 0.8798611111111111 | 0 |
| 0.8805555555555555 | 0 |
| 0.88125 | 0 |
| 0.8819444444444445 | 0 |
| 0.8826388888888889 | 0 |
| 0.8833333333333333 | 0 |
| 0.8840277777777777 | 0 |
| 0.8847222222222223 | 0 |
| 0.8854166666666666 | 0 |
| 0.8861111111111111 | 0 |
| 0.8868055555555556 | 0 |
| 0.8875000000000001 | 0 |
| 0.8881944444444444 | 0 |
| 0.8888888888888888 | 0 |
| 0.8895833333333334 | 0 |
| 0.8902777777777778 | 0 |
| 0.8909722222222222 | 0 |
| 0.8916666666666666 | 0 |
| 0.8923611111111112 | 0 |
| 0.8930555555555556 | 0 |
| 0.8937499999999999 | 0 |
| 0.8944444444444444 | 0 |
| 0.8951388888888889 | 0 |
| 0.8958333333333334 | 0 |
| 0.8965277777777777 | 0 |
| 0.8972222222222223 | 0 |
| 0.8979166666666667 | 0 |
| 0.8986111111111111 | 0 |
| 0.8993055555555555 | 0 |
| 0.9 | 0 |
| 0.9006944444444445 | 0 |
| 0.9013888888888889 | 0 |
| 0.9020833333333332 | 0 |
| 0.9027777777777778 | 0 |
| 0.9034722222222222 | 0 |
| 0.9041666666666667 | 0 |
| 0.904861111111111 | 0 |
| 0.9055555555555556 | 0 |
| 0.90625 | 0 |
| 0.9069444444444444 | 0 |
| 0.907638888888889 | 0 |
| 0.9083333333333333 | 0 |
| 0.9090277777777778 | 0 |
| 0.9097222222222222 | 0 |
| 0.9104166666666668 | 0 |
| 0.9111111111111111 | 0 |
| 0.9118055555555555 | 0 |
| 0.9125 | 0 |
| 0.9131944444444445 | 0 |
| 0.9138888888888889 | 0 |
| 0.9145833333333333 | 0 |
| 0.9152777777777777 | 0 |
| 0.9159722222222223 | 0 |
| 0.9166666666666666 | 0 |
| 0.9173611111111111 | 0 |
| 0.9180555555555556 | 0 |
| 0.9187500000000001 | 0 |
| 0.9194444444444444 | 0 |
| 0.9201388888888888 | 0 |
| 0.9208333333333334 | 0 |
| 0.9215277777777778 | 0 |
| 0.9222222222222222 | 0 |
| 0.9229166666666666 | 0 |
| 0.9236111111111112 | 0 |
| 0.9243055555555556 | 0 |
| 0.9249999999999999 | 0 |
| 0.9256944444444444 | 0 |
| 0.9263888888888889 | 0 |
| 0.9270833333333334 | 0 |
| 0.9277777777777777 | 0 |
| 0.9284722222222223 | 0 |
| 0.9291666666666667 | 0 |
| 0.9298611111111111 | 0 |
| 0.9305555555555555 | 0 |
| 0.93125 | 0 |
| 0.9319444444444445 | 0 |
| 0.9326388888888889 | 0 |
| 0.9333333333333332 | 0 |
| 0.9340277777777778 | 0 |
| 0.9347222222222222 | 0 |
| 0.9354166666666667 | 0 |
| 0.936111111111111 | 0 |
| 0.9368055555555556 | 0 |
| 0.9375 | 0 |
| 0.9381944444444444 | 0 |
| 0.938888888888889 | 0 |
| 0.9395833333333333 | 0 |
| 0.9402777777777778 | 0 |
| 0.9409722222222222 | 0 |
| 0.9416666666666668 | 0 |
| 0.9423611111111111 | 0 |
| 0.9430555555555555 | 0 |
| 0.94375 | 0 |
| 0.9444444444444445 | 0 |
| 0.9451388888888889 | 0 |
| 0.9458333333333333 | 0 |
| 0.9465277777777777 | 0 |
| 0.9472222222222223 | 0 |
| 0.9479166666666666 | 0 |
| 0.9486111111111111 | 0 |
| 0.9493055555555556 | 0 |
| 0.9500000000000001 | 0 |
| 0.9506944444444444 | 0 |
| 0.9513888888888888 | 0 |
| 0.9520833333333334 | 0 |
| 0.9527777777777778 | 0 |
| 0.9534722222222222 | 0 |
| 0.9541666666666666 | 0 |
| 0.9548611111111112 | 0 |
| 0.9555555555555556 | 0 |
| 0.9562499999999999 | 0 |
| 0.9569444444444444 | 0 |
| 0.9576388888888889 | 0 |
| 0.9583333333333334 | 0 |
| 0.9590277777777777 | 0 |
| 0.9597222222222223 | 0 |
| 0.9604166666666667 | 0 |
| 0.9611111111111111 | 0 |
| 0.9618055555555555 | 0 |
| 0.9625 | 0 |
| 0.9631944444444445 | 0 |
| 0.9638888888888889 | 0 |
| 0.9645833333333332 | 0 |
| 0.9652777777777778 | 0 |
| 0.9659722222222222 | 0 |
| 0.9666666666666667 | 0 |
| 0.967361111111111 | 0 |
| 0.9680555555555556 | 0 |
| 0.96875 | 0 |
| 0.9694444444444444 | 0 |
| 0.970138888888889 | 0 |
| 0.9708333333333333 | 0 |
| 0.9715277777777778 | 0 |
| 0.9722222222222222 | 0 |
| 0.9729166666666668 | 0 |
| 0.9736111111111111 | 0 |
| 0.9743055555555555 | 0 |
| 0.975 | 0 |
| 0.9756944444444445 | 0 |
| 0.9763888888888889 | 0 |
| 0.9770833333333333 | 0 |
| 0.9777777777777777 | 0 |
| 0.9784722222222223 | 0 |
| 0.9791666666666666 | 0 |
| 0.9798611111111111 | 0 |
| 0.9805555555555556 | 0 |
| 0.9812500000000001 | 0 |
| 0.9819444444444444 | 0 |
| 0.9826388888888888 | 0 |
| 0.9833333333333334 | 0 |
| 0.9840277777777778 | 0 |
| 0.9847222222222222 | 0 |
| 0.9854166666666666 | 0 |
| 0.9861111111111112 | 0 |
| 0.9868055555555556 | 0 |
| 0.9874999999999999 | 0 |
| 0.9881944444444444 | 0 |
| 0.9888888888888889 | 0 |
| 0.9895833333333334 | 0 |
| 0.9902777777777777 | 0 |
| 0.9909722222222223 | 0 |
| 0.9916666666666667 | 0 |
| 0.9923611111111111 | 0 |
| 0.9930555555555555 | 0 |
| 0.99375 | 0 |
| 0.9944444444444445 | 0 |
| 0.9951388888888889 | 0 |
| 0.9958333333333332 | 0 |
| 0.9965277777777778 | 0 |
| 0.9972222222222222 | 0 |
| 0.9979166666666667 | 0 |
| 0.998611111111111 | 0 |
| 0.9993055555555556 | 0 |